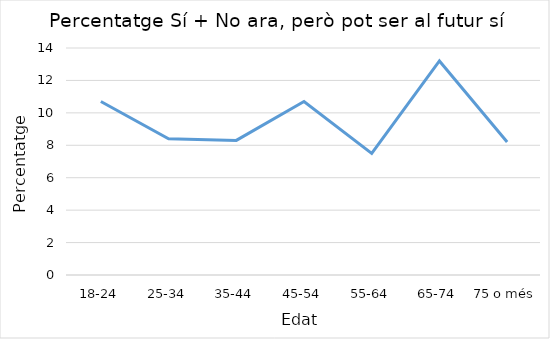
| Category | Series 0 |
|---|---|
| 18-24 | 10.7 |
| 25-34 | 8.4 |
| 35-44 | 8.3 |
| 45-54 | 10.7 |
| 55-64 | 7.5 |
| 65-74 | 13.2 |
| 75 o més | 8.2 |